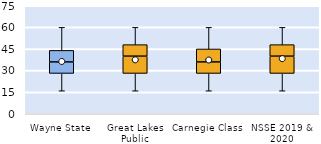
| Category | 25th | 50th | 75th |
|---|---|---|---|
| Wayne State | 28 | 8 | 8 |
| Great Lakes Public | 28 | 12 | 8 |
| Carnegie Class | 28 | 8 | 9 |
| NSSE 2019 & 2020 | 28 | 12 | 8 |